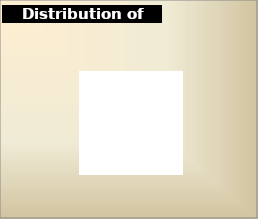
| Category | Series 0 |
|---|---|
| Offices | 0 |
| Workstations | 0 |
| Standard Support Spaces | 0 |
| Special Support Spaces | 0 |
| Internal Circulation | 0 |
| Fit Factor Adjustment | 0 |